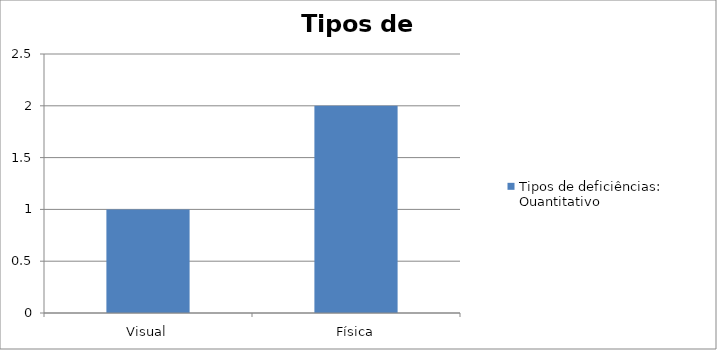
| Category | Tipos de deficiências: Quantitativo |
|---|---|
| Visual | 1 |
| Física | 2 |